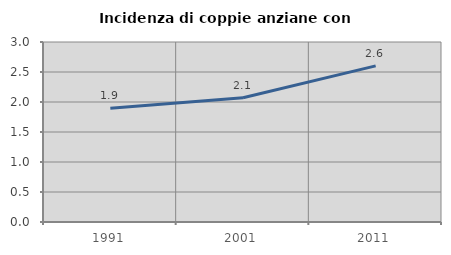
| Category | Incidenza di coppie anziane con figli |
|---|---|
| 1991.0 | 1.898 |
| 2001.0 | 2.072 |
| 2011.0 | 2.602 |